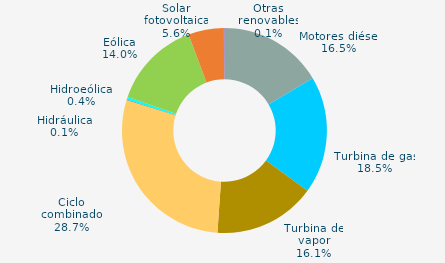
| Category | Series 0 |
|---|---|
| Motores diésel | 16.5 |
| Turbina de gas | 18.5 |
| Turbina de vapor | 16.1 |
| Ciclo combinado | 28.7 |
| Cogeneración | 0 |
| Hidráulica | 0.1 |
| Hidroeólica | 0.4 |
| Eólica | 14 |
| Solar fotovoltaica | 5.6 |
| Otras renovables | 0.1 |